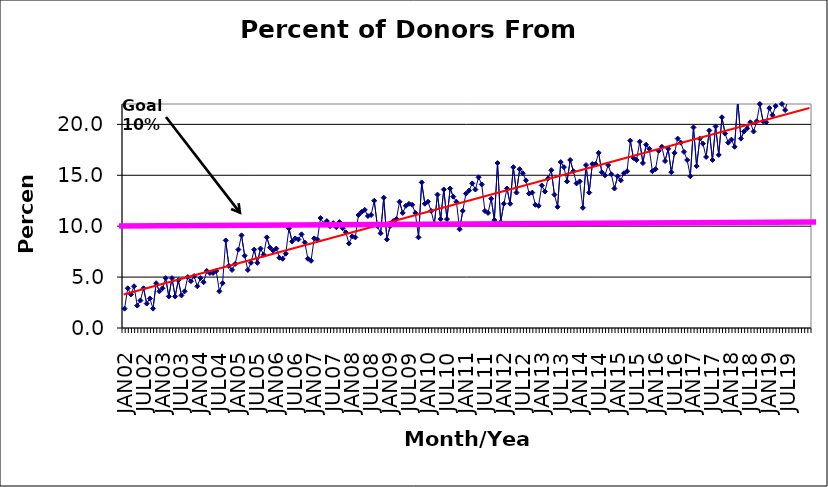
| Category | Series 0 |
|---|---|
| JAN02 | 1.9 |
| FEB02 | 3.9 |
| MAR02 | 3.3 |
| APR02 | 4.1 |
| MAY02 | 2.2 |
| JUN02 | 2.7 |
| JUL02 | 3.9 |
| AUG02 | 2.4 |
| SEP02 | 2.9 |
| OCT02 | 1.9 |
| NOV02 | 4.4 |
| DEC02 | 3.6 |
| JAN03 | 3.9 |
| FEB03 | 4.9 |
| MAR03 | 3.1 |
| APR03 | 4.9 |
| MAY03 | 3.1 |
| JUN03 | 4.7 |
| JUL03 | 3.2 |
| AUG03 | 3.6 |
| SEP03 | 5 |
| OCT03 | 4.6 |
| NOV03 | 5.1 |
| DEC03 | 4.1 |
| JAN04 | 4.9 |
| FEB04 | 4.5 |
| MAR04 | 5.6 |
| APR04 | 5.4 |
| MAY04 | 5.4 |
| JUN04 | 5.6 |
| JUL04 | 3.6 |
| AUG04 | 4.4 |
| SEP04 | 8.6 |
| OCT04 | 6.1 |
| NOV04 | 5.7 |
| DEC04 | 6.3 |
| JAN05 | 7.7 |
| FEB05 | 9.1 |
| MAR05 | 7.1 |
| APR05 | 5.7 |
| MAY05 | 6.4 |
| JUN05 | 7.7 |
| JUL05 | 6.4 |
| AUG05 | 7.8 |
| SEP05 | 7.2 |
| OCT05 | 8.9 |
| NOV05 | 7.9 |
| DEC05 | 7.6 |
| JAN06 | 7.8 |
| FEB06 | 6.9 |
| MAR06 | 6.8 |
| APR06 | 7.3 |
| MAY06 | 9.8 |
| JUN06 | 8.5 |
| JUL06 | 8.8 |
| AUG06 | 8.7 |
| SEP06 | 9.2 |
| OCT06 | 8.4 |
| NOV06 | 6.8 |
| DEC06 | 6.6 |
| JAN07 | 8.8 |
| FEB07 | 8.7 |
| MAR07 | 10.8 |
| APR07 | 10.2 |
| MAY07 | 10.5 |
| JUN07 | 10 |
| JUL07 | 10.3 |
| AUG07 | 9.9 |
| SEP07 | 10.4 |
| OCT07 | 9.8 |
| NOV07 | 9.4 |
| DEC07 | 8.3 |
| JAN08 | 9 |
| FEB08 | 8.9 |
| MAR08 | 11.1 |
| APR08 | 11.4 |
| MAY08 | 11.6 |
| JUN08 | 11 |
| JUL08 | 11.1 |
| AUG08 | 12.5 |
| SEP08 | 10 |
| OCT08 | 9.3 |
| NOV08 | 12.8 |
| DEC08 | 8.7 |
| JAN09 | 10 |
| FEB09 | 10.5 |
| MAR09 | 10.7 |
| APR09 | 12.4 |
| MAY09 | 11.3 |
| JUN09 | 12 |
| JUL09 | 12.2 |
| AUG09 | 12.1 |
| SEP09 | 11.3 |
| OCT09 | 8.9 |
| NOV09 | 14.3 |
| DEC09 | 12.2 |
| JAN10 | 12.4 |
| FEB10 | 11.5 |
| MAR10 | 10.2 |
| APR10 | 13.1 |
| MAY10 | 10.7 |
| JUN10 | 13.6 |
| JUL10 | 10.7 |
| AUG10 | 13.7 |
| SEP10 | 12.9 |
| OCT10 | 12.4 |
| NOV10 | 9.7 |
| DEC10 | 11.5 |
| JAN11 | 13.2 |
| FEB11 | 13.5 |
| MAR11 | 14.2 |
| APR11 | 13.6 |
| MAY11 | 14.8 |
| JUN11 | 14.1 |
| JUL11 | 11.5 |
| AUG11 | 11.3 |
| SEP11 | 12.7 |
| OCT11 | 10.6 |
| NOV11 | 16.2 |
| DEC11 | 10.4 |
| JAN12 | 12.2 |
| FEB12 | 13.7 |
| MAR12 | 12.2 |
| APR12 | 15.8 |
| MAY12 | 13.3 |
| JUN12 | 15.6 |
| JUL12 | 15.2 |
| AUG12 | 14.5 |
| SEP12 | 13.2 |
| OCT12 | 13.3 |
| NOV12 | 12.1 |
| DEC12 | 12 |
| JAN13 | 14 |
| FEB13 | 13.4 |
| MAR13 | 14.7 |
| APR13 | 15.5 |
| MAY13 | 13.1 |
| JUN13 | 11.9 |
| JUL13 | 16.3 |
| AUG13 | 15.8 |
| SEP13 | 14.4 |
| OCT13 | 16.5 |
| NOV13 | 15.4 |
| DEC13 | 14.2 |
| JAN14 | 14.4 |
| FEB14 | 11.8 |
| MAR14 | 16 |
| APR14 | 13.3 |
| MAY14 | 16.1 |
| JUN14 | 16.1 |
| JUL14 | 17.2 |
| AUG14 | 15.3 |
| SEP14 | 15 |
| OCT14 | 16 |
| NOV14 | 15.1 |
| DEC14 | 13.7 |
| JAN15 | 14.9 |
| FEB15 | 14.5 |
| MAR15 | 15.2 |
| APR15 | 15.4 |
| MAY15 | 18.4 |
| JUN15 | 16.7 |
| JUL15 | 16.5 |
| AUG15 | 18.3 |
| SEP15 | 16.2 |
| OCT15 | 18 |
| NOV15 | 17.6 |
| DEC15 | 15.4 |
| JAN16 | 15.6 |
| FEB16 | 17.4 |
| MAR16 | 17.8 |
| APR16 | 16.4 |
| MAY16 | 17.6 |
| JUN16 | 15.3 |
| JUL16 | 17.2 |
| AUG16 | 18.6 |
| SEP16 | 18.2 |
| OCT16 | 17.3 |
| NOV16 | 16.5 |
| DEC16 | 14.9 |
| JAN17 | 19.7 |
| FEB17 | 15.9 |
| MAR17 | 18.6 |
| APR17 | 18.1 |
| MAY17 | 16.8 |
| JUN17 | 19.4 |
| JUL17 | 16.5 |
| AUG17 | 19.8 |
| SEP17 | 17 |
| OCT17 | 20.7 |
| NOV17 | 19.1 |
| DEC17 | 18.2 |
| JAN18 | 18.5 |
| FEB18 | 17.8 |
| MAR18 | 22.4 |
| APR18 | 18.6 |
| MAY18 | 19.3 |
| JUN18 | 19.6 |
| JUL18 | 20.2 |
| AUG18 | 19.3 |
| SEP18 | 20.3 |
| OCT18 | 22 |
| NOV18 | 20.3 |
| DEC18 | 20.2 |
| JAN19 | 21.6 |
| FEB19 | 20.9 |
| MAR19 | 21.8 |
| APR19 | 22.2 |
| MAY19 | 22 |
| JUN19 | 21.4 |
| JUL19 | 22.6 |
| AUG19 | 23.2 |
| SEP19 | 25.3 |
| OCT19 | 23.5 |
| NOV19 | 24.7 |
| DEC19 | 24.9 |